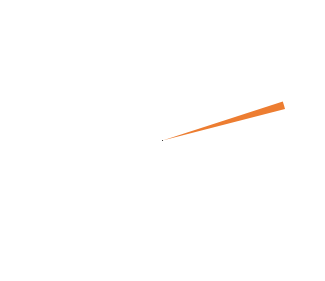
| Category | Series 0 |
|---|---|
| 0 | 0.9 |
| 1 | 0.02 |
| 2 | 1.08 |